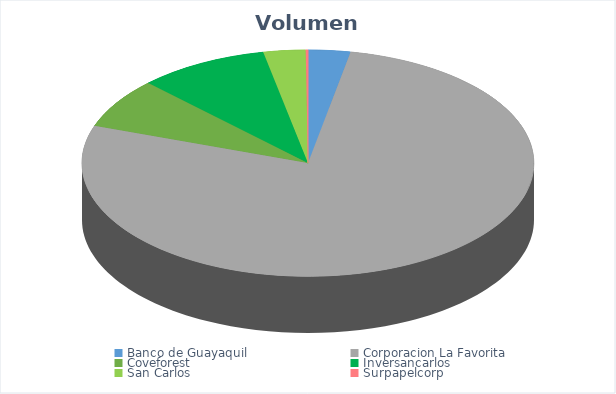
| Category | VOLUMEN ($USD) |
|---|---|
| Banco de Guayaquil | 6309.8 |
| Corporacion La Favorita | 161892.16 |
| Coveforest | 15007.2 |
| Inversancarlos | 19490 |
| San Carlos | 6300 |
| Surpapelcorp | 340 |